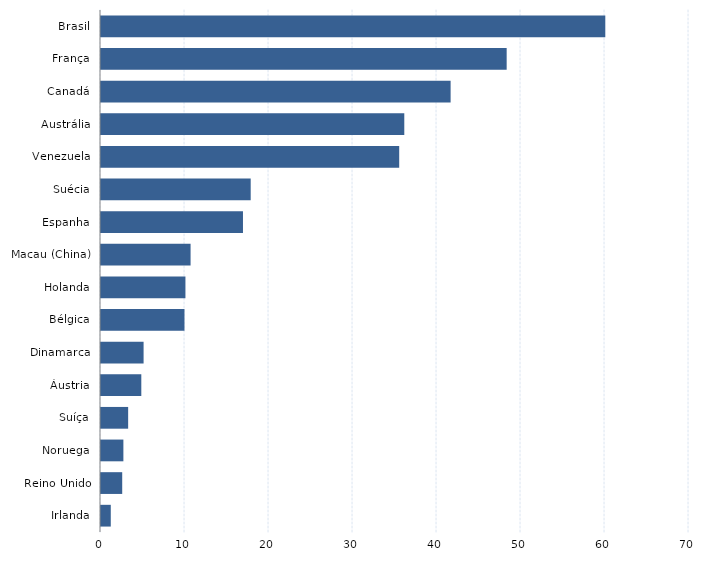
| Category | Series 0 |
|---|---|
| Irlanda | 1.164 |
| Reino Unido | 2.525 |
| Noruega | 2.665 |
| Suíça | 3.233 |
| Áustria | 4.799 |
| Dinamarca | 5.07 |
| Bélgica | 9.937 |
| Holanda | 10.052 |
| Macau (China) | 10.664 |
| Espanha | 16.902 |
| Suécia | 17.82 |
| Venezuela | 35.501 |
| Austrália | 36.107 |
| Canadá | 41.621 |
| França | 48.294 |
| Brasil | 60.035 |